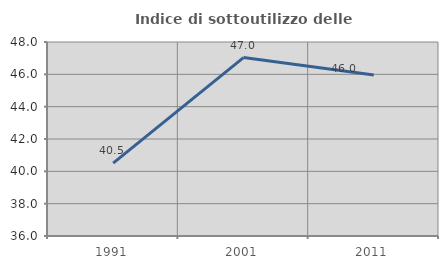
| Category | Indice di sottoutilizzo delle abitazioni  |
|---|---|
| 1991.0 | 40.511 |
| 2001.0 | 47.036 |
| 2011.0 | 45.954 |